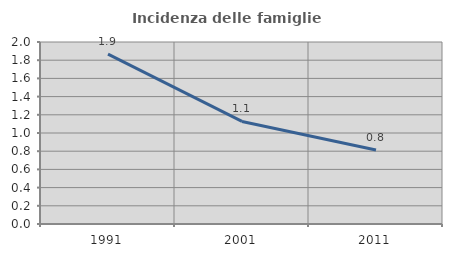
| Category | Incidenza delle famiglie numerose |
|---|---|
| 1991.0 | 1.867 |
| 2001.0 | 1.127 |
| 2011.0 | 0.813 |